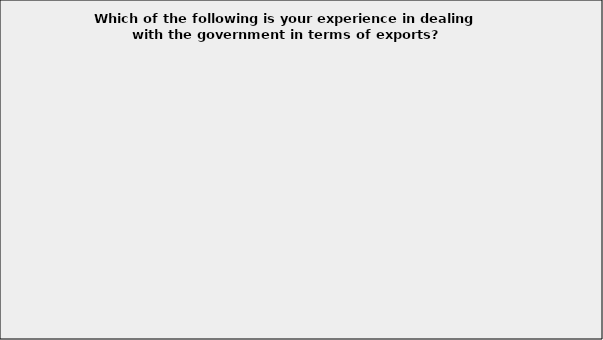
| Category | Series 0 |
|---|---|
| It is difficult to get hold of the right person | 0.275 |
| I don't know who the right person is | 0.3 |
| There are not enough staff‎ to help | 0.25 |
| The staff are not sufficiently qualified to be able to help | 0.325 |
| The staff lack any commercial appreciation of how complicated they make life for a business | 0.45 |
| There is a persistent failure to communicate or respond | 0.1 |
| There is a general lack of accountability | 0.325 |
| Inability to formally complain / appeal for common sense | 0.15 |